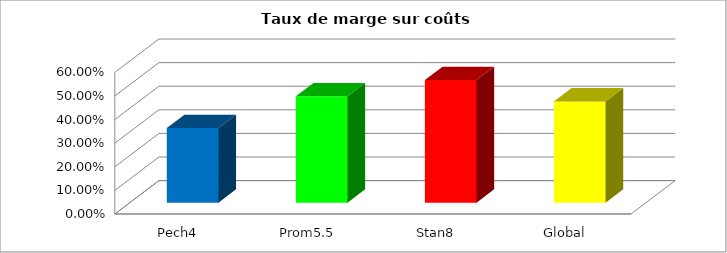
| Category | Series 0 |
|---|---|
| Pech4 | 0.316 |
| Prom5.5 | 0.451 |
| Stan8 | 0.52 |
| Global | 0.429 |